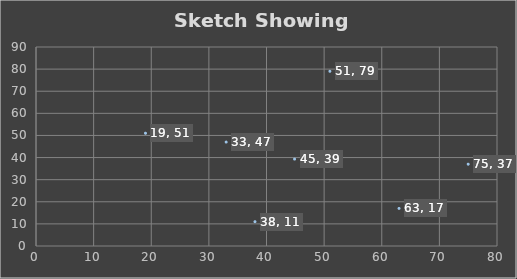
| Category | y coordinate |
|---|---|
| 19.0 | 51 |
| 51.0 | 79 |
| 63.0 | 17 |
| 33.0 | 47 |
| 38.0 | 11 |
| 75.0 | 37 |
| 44.872053872053876 | 39.3 |